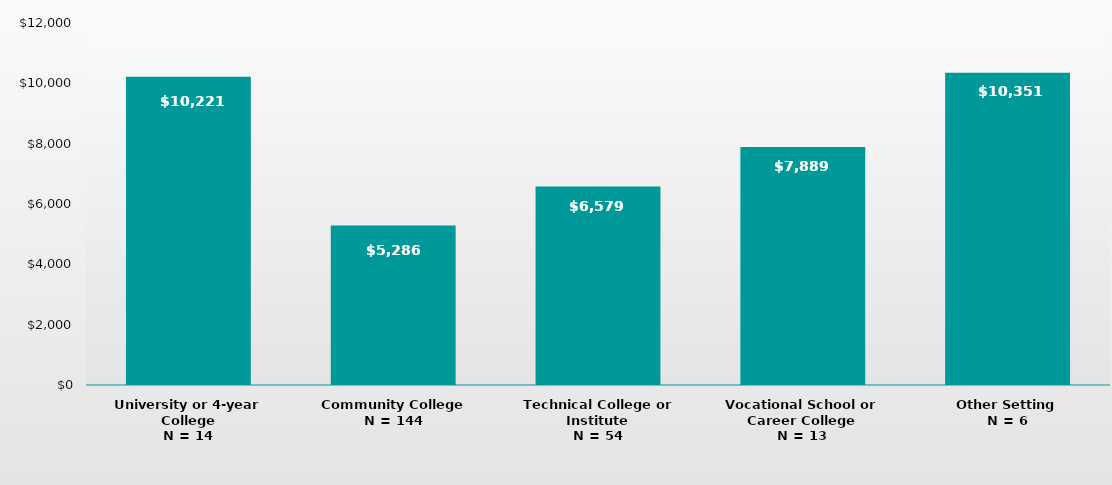
| Category | Series 0 |
|---|---|
| University or 4-year College
N = 14 | 10221 |
| Community College
N = 144 | 5286 |
| Technical College or Institute
N = 54 | 6579 |
| Vocational School or Career College
N = 13 | 7889 |
| Other Setting
N = 6 | 10351 |